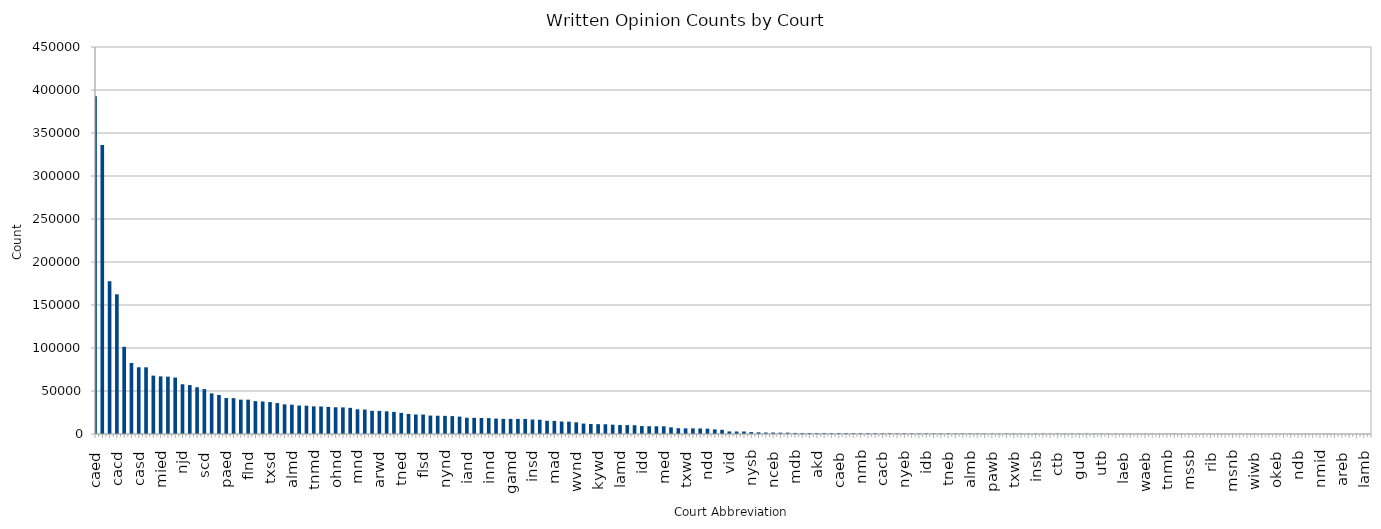
| Category | Series 0 |
|---|---|
| caed | 392825 |
| cand | 335951 |
| cod | 177733 |
| cacd | 162421 |
| ned | 101356 |
| nvd | 82620 |
| casd | 77582 |
| azd | 77534 |
| flmd | 67898 |
| mied | 67006 |
| ncwd | 66686 |
| wawd | 65619 |
| njd | 57812 |
| ared | 56872 |
| ilnd | 54364 |
| scd | 52197 |
| ilsd | 47200 |
| txnd | 45360 |
| paed | 41806 |
| nyed | 41702 |
| nysd | 39934 |
| flnd | 39914 |
| ohsd | 38204 |
| nced | 37791 |
| txsd | 37115 |
| nmd | 35929 |
| moed | 34465 |
| almd | 34119 |
| lawd | 33044 |
| miwd | 32892 |
| tnmd | 32116 |
| txed | 31984 |
| pamd | 31452 |
| ohnd | 31058 |
| gasd | 30928 |
| pawd | 30396 |
| mnd | 28713 |
| laed | 28449 |
| ord | 26979 |
| arwd | 26866 |
| mssd | 26371 |
| waed | 25693 |
| tned | 24542 |
| alnd | 23332 |
| ksd | 22653 |
| flsd | 22612 |
| vawd | 21422 |
| mdd | 21238 |
| nynd | 21120 |
| dcd | 20815 |
| tnwd | 20238 |
| iand | 18916 |
| wiwd | 18801 |
| alsd | 18587 |
| innd | 18452 |
| wvsd | 17927 |
| vaed | 17628 |
| gamd | 17591 |
| wied | 17520 |
| nywd | 17504 |
| insd | 16838 |
| mowd | 16559 |
| okwd | 15349 |
| mad | 15244 |
| nhd | 14528 |
| kyed | 14350 |
| wvnd | 13566 |
| ctd | 12096 |
| msnd | 11653 |
| kywd | 11445 |
| utd | 11327 |
| gand | 10853 |
| lamd | 10411 |
| ilcd | 10344 |
| prd | 10201 |
| idd | 9230 |
| ded | 9058 |
| mtd | 8982 |
| med | 8964 |
| hid | 7702 |
| oked | 6736 |
| txwd | 6551 |
| oknd | 6492 |
| ncmd | 6448 |
| ndd | 6244 |
| sdd | 5344 |
| rid | 4894 |
| vid | 2990 |
| iasd | 2907 |
| vtd | 2898 |
| nysb | 2206 |
| ilnb | 1899 |
| ohnb | 1702 |
| nceb | 1694 |
| canb | 1581 |
| txsb | 1577 |
| mdb | 1257 |
| mab | 1189 |
| deb | 1141 |
| akd | 1090 |
| paeb | 1086 |
| vaeb | 1074 |
| caeb | 1069 |
| dcb | 997 |
| mowb | 990 |
| nmb | 989 |
| njb | 981 |
| ksb | 931 |
| cacb | 851 |
| neb | 846 |
| txnb | 812 |
| nyeb | 810 |
| flsb | 781 |
| flmb | 754 |
| idb | 735 |
| azb | 660 |
| pamb | 659 |
| tneb | 637 |
| alnb | 628 |
| ianb | 582 |
| almb | 535 |
| ncmb | 514 |
| orb | 501 |
| pawb | 488 |
| ilcb | 479 |
| gasb | 476 |
| txwb | 472 |
| mtb | 446 |
| cob | 414 |
| insb | 407 |
| vawb | 404 |
| vtb | 389 |
| ctb | 388 |
| scb | 385 |
| hib | 384 |
| gud | 379 |
| kyeb | 365 |
| akb | 359 |
| utb | 337 |
| wieb | 316 |
| txeb | 305 |
| laeb | 301 |
| kywb | 300 |
| nywb | 295 |
| waeb | 290 |
| nynb | 267 |
| alsb | 249 |
| tnmb | 234 |
| wvsb | 234 |
| ncwb | 225 |
| mssb | 216 |
| lawb | 204 |
| wvnb | 201 |
| rib | 200 |
| nhb | 196 |
| wawb | 191 |
| msnb | 175 |
| gamb | 169 |
| moeb | 168 |
| wiwb | 167 |
| wyd | 154 |
| ilsb | 151 |
| okeb | 147 |
| sdb | 126 |
| meb | 122 |
| ndb | 115 |
| wyb | 115 |
| oknb | 105 |
| nmid | 104 |
| flnb | 89 |
| okwb | 85 |
| areb | 77 |
| arwb | 70 |
| iasb | 67 |
| lamb | 60 |
| mnb | 39 |